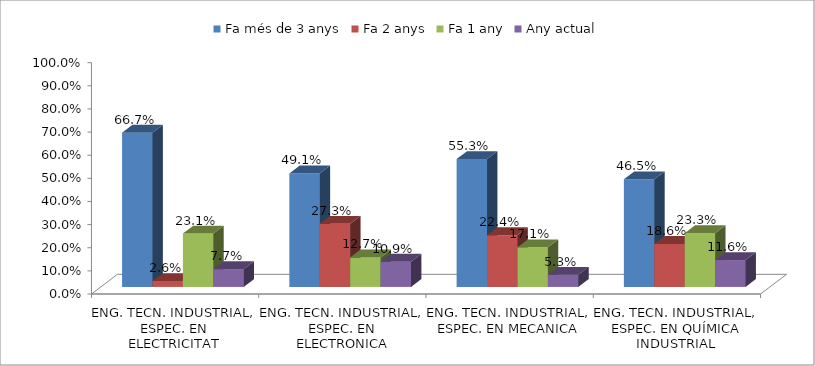
| Category | Fa més de 3 anys | Fa 2 anys | Fa 1 any | Any actual |
|---|---|---|---|---|
| ENG. TECN. INDUSTRIAL, ESPEC. EN ELECTRICITAT | 0.667 | 0.026 | 0.231 | 0.077 |
| ENG. TECN. INDUSTRIAL, ESPEC. EN ELECTRONICA INDUSTRIAL | 0.491 | 0.273 | 0.127 | 0.109 |
| ENG. TECN. INDUSTRIAL, ESPEC. EN MECANICA | 0.553 | 0.224 | 0.171 | 0.053 |
| ENG. TECN. INDUSTRIAL, ESPEC. EN QUÍMICA INDUSTRIAL | 0.465 | 0.186 | 0.233 | 0.116 |